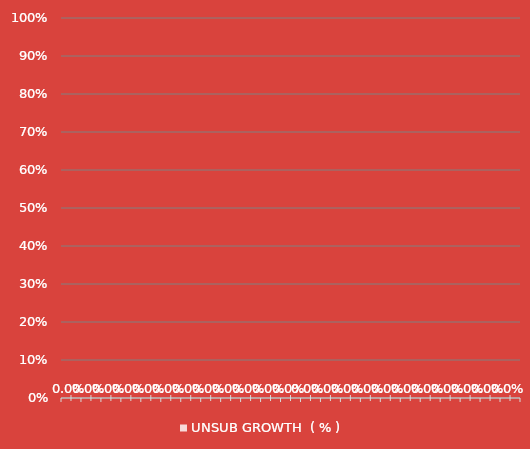
| Category | UNSUB GROWTH  ( % ) |
|---|---|
|  | 0 |
|  | 0 |
|  | 0 |
|  | 0 |
|  | 0 |
|  | 0 |
|  | 0 |
|  | 0 |
|  | 0 |
|  | 0 |
|  | 0 |
|  | 0 |
|  | 0 |
|  | 0 |
|  | 0 |
|  | 0 |
|  | 0 |
|  | 0 |
|  | 0 |
|  | 0 |
|  | 0 |
|  | 0 |
|  | 0 |